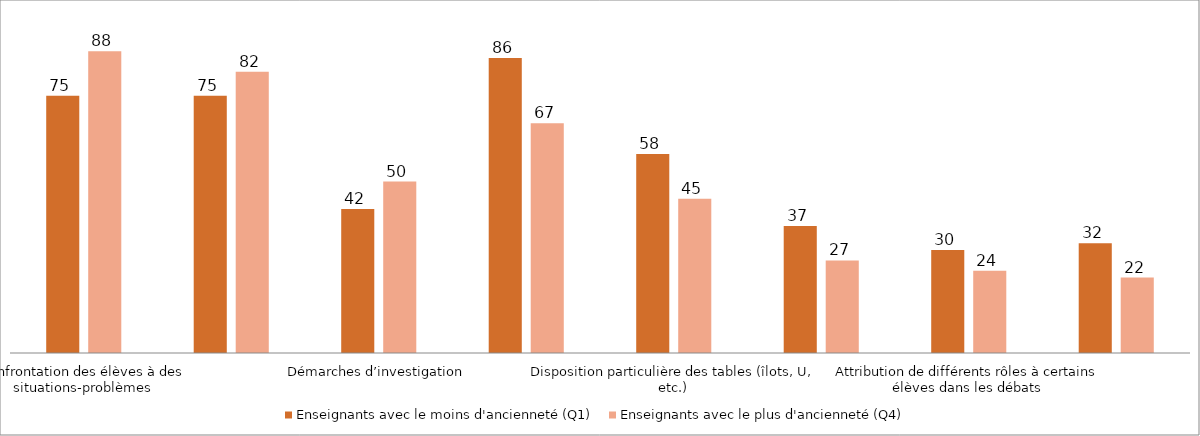
| Category | Enseignants avec le moins d'ancienneté (Q1) | Enseignants avec le plus d'ancienneté (Q4) |
|---|---|---|
| Confrontation des élèves à des situations-problèmes | 75 | 88 |
| Activités mobilisant les connaissances dans une situation nouvelle | 75 | 82 |
| Démarches d’investigation | 42 | 50 |
| Différentes modalités d'apprentissage prévues au cours d'une séance | 86 | 67 |
| Disposition particulière des tables (îlots, U, etc.) | 58 | 45 |
| Délégation des responsabilités lors des travaux de groupe | 37 | 27 |
| Attribution de différents rôles à certains élèves dans les débats | 30 | 24 |
| Mention de différentes postures à adopter dans les préparations de cours | 32 | 22 |